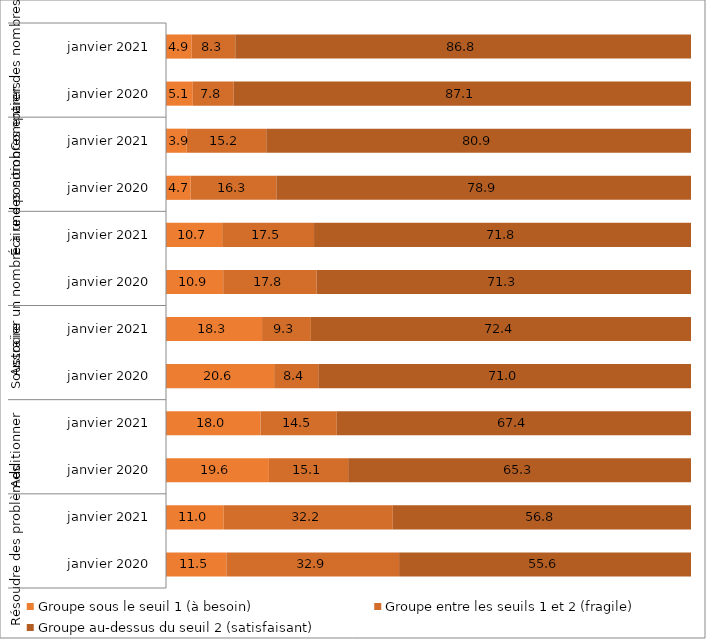
| Category | Groupe sous le seuil 1 (à besoin) | Groupe entre les seuils 1 et 2 (fragile) | Groupe au-dessus du seuil 2 (satisfaisant) |
|---|---|---|---|
| 0 | 11.5 | 32.9 | 55.6 |
| 1 | 11 | 32.2 | 56.8 |
| 2 | 19.6 | 15.1 | 65.3 |
| 3 | 18 | 14.5 | 67.4 |
| 4 | 20.6 | 8.4 | 71 |
| 5 | 18.3 | 9.3 | 72.4 |
| 6 | 10.9 | 17.8 | 71.3 |
| 7 | 10.7 | 17.5 | 71.8 |
| 8 | 4.7 | 16.3 | 78.9 |
| 9 | 3.9 | 15.2 | 80.9 |
| 10 | 5.1 | 7.8 | 87.1 |
| 11 | 4.9 | 8.3 | 86.8 |